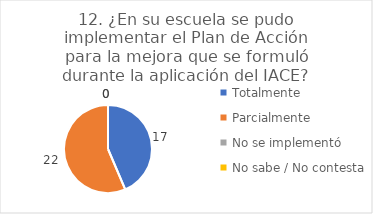
| Category | 12. ¿En su escuela se pudo implementar el Plan de Acción para la mejora que se formuló durante la aplicación del IACE? |
|---|---|
| Totalmente  | 0.436 |
| Parcialmente  | 0.564 |
| No se implementó  | 0 |
| No sabe / No contesta | 0 |